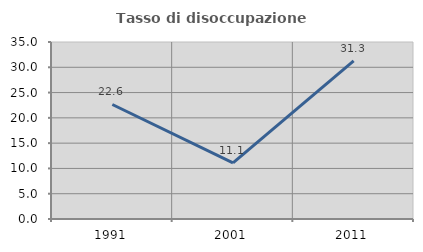
| Category | Tasso di disoccupazione giovanile  |
|---|---|
| 1991.0 | 22.642 |
| 2001.0 | 11.111 |
| 2011.0 | 31.25 |